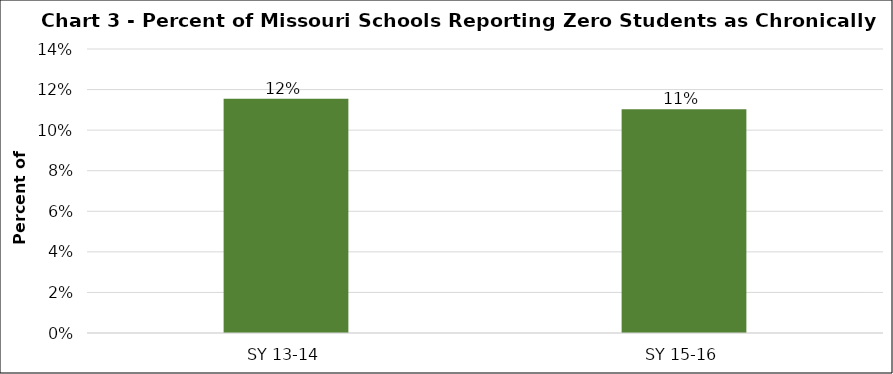
| Category | Series 0 |
|---|---|
| SY 13-14 | 0.115 |
| SY 15-16 | 0.11 |